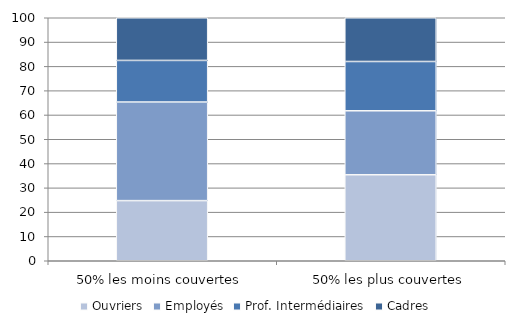
| Category | Ouvriers | Employés | Prof. Intermédiaires | Cadres |
|---|---|---|---|---|
| 50% les moins couvertes | 24.748 | 40.576 | 17.119 | 17.557 |
| 50% les plus couvertes | 35.397 | 26.323 | 20.282 | 17.998 |